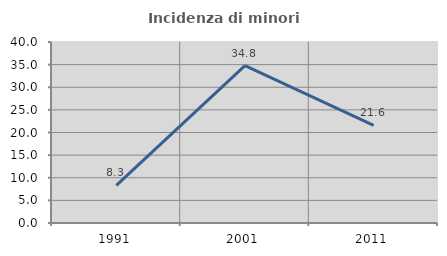
| Category | Incidenza di minori stranieri |
|---|---|
| 1991.0 | 8.333 |
| 2001.0 | 34.783 |
| 2011.0 | 21.569 |